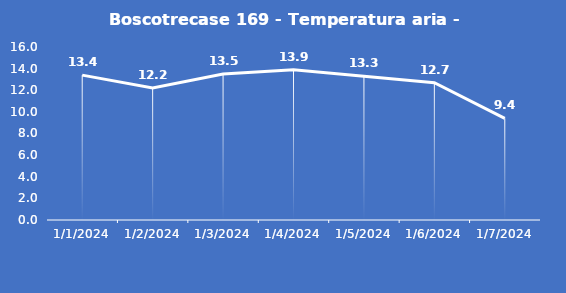
| Category | Boscotrecase 169 - Temperatura aria - Grezzo (°C) |
|---|---|
| 1/1/24 | 13.4 |
| 1/2/24 | 12.2 |
| 1/3/24 | 13.5 |
| 1/4/24 | 13.9 |
| 1/5/24 | 13.3 |
| 1/6/24 | 12.7 |
| 1/7/24 | 9.4 |